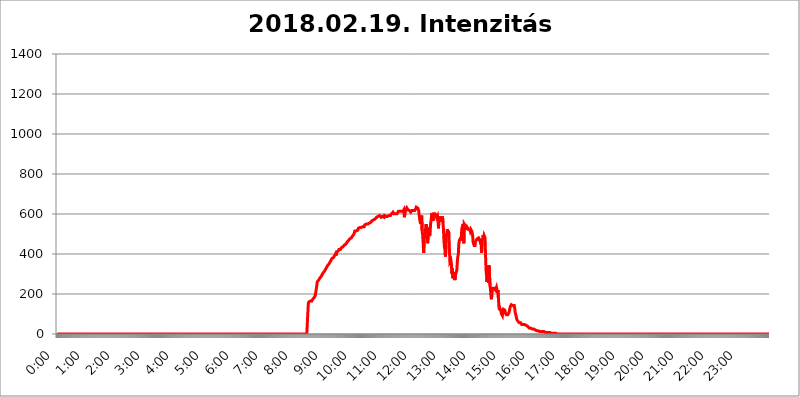
| Category | 2018.02.19. Intenzitás [W/m^2] |
|---|---|
| 0.0 | 0 |
| 0.0006944444444444445 | 0 |
| 0.001388888888888889 | 0 |
| 0.0020833333333333333 | 0 |
| 0.002777777777777778 | 0 |
| 0.003472222222222222 | 0 |
| 0.004166666666666667 | 0 |
| 0.004861111111111111 | 0 |
| 0.005555555555555556 | 0 |
| 0.0062499999999999995 | 0 |
| 0.006944444444444444 | 0 |
| 0.007638888888888889 | 0 |
| 0.008333333333333333 | 0 |
| 0.009027777777777779 | 0 |
| 0.009722222222222222 | 0 |
| 0.010416666666666666 | 0 |
| 0.011111111111111112 | 0 |
| 0.011805555555555555 | 0 |
| 0.012499999999999999 | 0 |
| 0.013194444444444444 | 0 |
| 0.013888888888888888 | 0 |
| 0.014583333333333332 | 0 |
| 0.015277777777777777 | 0 |
| 0.015972222222222224 | 0 |
| 0.016666666666666666 | 0 |
| 0.017361111111111112 | 0 |
| 0.018055555555555557 | 0 |
| 0.01875 | 0 |
| 0.019444444444444445 | 0 |
| 0.02013888888888889 | 0 |
| 0.020833333333333332 | 0 |
| 0.02152777777777778 | 0 |
| 0.022222222222222223 | 0 |
| 0.02291666666666667 | 0 |
| 0.02361111111111111 | 0 |
| 0.024305555555555556 | 0 |
| 0.024999999999999998 | 0 |
| 0.025694444444444447 | 0 |
| 0.02638888888888889 | 0 |
| 0.027083333333333334 | 0 |
| 0.027777777777777776 | 0 |
| 0.02847222222222222 | 0 |
| 0.029166666666666664 | 0 |
| 0.029861111111111113 | 0 |
| 0.030555555555555555 | 0 |
| 0.03125 | 0 |
| 0.03194444444444445 | 0 |
| 0.03263888888888889 | 0 |
| 0.03333333333333333 | 0 |
| 0.034027777777777775 | 0 |
| 0.034722222222222224 | 0 |
| 0.035416666666666666 | 0 |
| 0.036111111111111115 | 0 |
| 0.03680555555555556 | 0 |
| 0.0375 | 0 |
| 0.03819444444444444 | 0 |
| 0.03888888888888889 | 0 |
| 0.03958333333333333 | 0 |
| 0.04027777777777778 | 0 |
| 0.04097222222222222 | 0 |
| 0.041666666666666664 | 0 |
| 0.042361111111111106 | 0 |
| 0.04305555555555556 | 0 |
| 0.043750000000000004 | 0 |
| 0.044444444444444446 | 0 |
| 0.04513888888888889 | 0 |
| 0.04583333333333334 | 0 |
| 0.04652777777777778 | 0 |
| 0.04722222222222222 | 0 |
| 0.04791666666666666 | 0 |
| 0.04861111111111111 | 0 |
| 0.049305555555555554 | 0 |
| 0.049999999999999996 | 0 |
| 0.05069444444444445 | 0 |
| 0.051388888888888894 | 0 |
| 0.052083333333333336 | 0 |
| 0.05277777777777778 | 0 |
| 0.05347222222222222 | 0 |
| 0.05416666666666667 | 0 |
| 0.05486111111111111 | 0 |
| 0.05555555555555555 | 0 |
| 0.05625 | 0 |
| 0.05694444444444444 | 0 |
| 0.057638888888888885 | 0 |
| 0.05833333333333333 | 0 |
| 0.05902777777777778 | 0 |
| 0.059722222222222225 | 0 |
| 0.06041666666666667 | 0 |
| 0.061111111111111116 | 0 |
| 0.06180555555555556 | 0 |
| 0.0625 | 0 |
| 0.06319444444444444 | 0 |
| 0.06388888888888888 | 0 |
| 0.06458333333333334 | 0 |
| 0.06527777777777778 | 0 |
| 0.06597222222222222 | 0 |
| 0.06666666666666667 | 0 |
| 0.06736111111111111 | 0 |
| 0.06805555555555555 | 0 |
| 0.06874999999999999 | 0 |
| 0.06944444444444443 | 0 |
| 0.07013888888888889 | 0 |
| 0.07083333333333333 | 0 |
| 0.07152777777777779 | 0 |
| 0.07222222222222223 | 0 |
| 0.07291666666666667 | 0 |
| 0.07361111111111111 | 0 |
| 0.07430555555555556 | 0 |
| 0.075 | 0 |
| 0.07569444444444444 | 0 |
| 0.0763888888888889 | 0 |
| 0.07708333333333334 | 0 |
| 0.07777777777777778 | 0 |
| 0.07847222222222222 | 0 |
| 0.07916666666666666 | 0 |
| 0.0798611111111111 | 0 |
| 0.08055555555555556 | 0 |
| 0.08125 | 0 |
| 0.08194444444444444 | 0 |
| 0.08263888888888889 | 0 |
| 0.08333333333333333 | 0 |
| 0.08402777777777777 | 0 |
| 0.08472222222222221 | 0 |
| 0.08541666666666665 | 0 |
| 0.08611111111111112 | 0 |
| 0.08680555555555557 | 0 |
| 0.08750000000000001 | 0 |
| 0.08819444444444445 | 0 |
| 0.08888888888888889 | 0 |
| 0.08958333333333333 | 0 |
| 0.09027777777777778 | 0 |
| 0.09097222222222222 | 0 |
| 0.09166666666666667 | 0 |
| 0.09236111111111112 | 0 |
| 0.09305555555555556 | 0 |
| 0.09375 | 0 |
| 0.09444444444444444 | 0 |
| 0.09513888888888888 | 0 |
| 0.09583333333333333 | 0 |
| 0.09652777777777777 | 0 |
| 0.09722222222222222 | 0 |
| 0.09791666666666667 | 0 |
| 0.09861111111111111 | 0 |
| 0.09930555555555555 | 0 |
| 0.09999999999999999 | 0 |
| 0.10069444444444443 | 0 |
| 0.1013888888888889 | 0 |
| 0.10208333333333335 | 0 |
| 0.10277777777777779 | 0 |
| 0.10347222222222223 | 0 |
| 0.10416666666666667 | 0 |
| 0.10486111111111111 | 0 |
| 0.10555555555555556 | 0 |
| 0.10625 | 0 |
| 0.10694444444444444 | 0 |
| 0.1076388888888889 | 0 |
| 0.10833333333333334 | 0 |
| 0.10902777777777778 | 0 |
| 0.10972222222222222 | 0 |
| 0.1111111111111111 | 0 |
| 0.11180555555555556 | 0 |
| 0.11180555555555556 | 0 |
| 0.1125 | 0 |
| 0.11319444444444444 | 0 |
| 0.11388888888888889 | 0 |
| 0.11458333333333333 | 0 |
| 0.11527777777777777 | 0 |
| 0.11597222222222221 | 0 |
| 0.11666666666666665 | 0 |
| 0.1173611111111111 | 0 |
| 0.11805555555555557 | 0 |
| 0.11944444444444445 | 0 |
| 0.12013888888888889 | 0 |
| 0.12083333333333333 | 0 |
| 0.12152777777777778 | 0 |
| 0.12222222222222223 | 0 |
| 0.12291666666666667 | 0 |
| 0.12291666666666667 | 0 |
| 0.12361111111111112 | 0 |
| 0.12430555555555556 | 0 |
| 0.125 | 0 |
| 0.12569444444444444 | 0 |
| 0.12638888888888888 | 0 |
| 0.12708333333333333 | 0 |
| 0.16875 | 0 |
| 0.12847222222222224 | 0 |
| 0.12916666666666668 | 0 |
| 0.12986111111111112 | 0 |
| 0.13055555555555556 | 0 |
| 0.13125 | 0 |
| 0.13194444444444445 | 0 |
| 0.1326388888888889 | 0 |
| 0.13333333333333333 | 0 |
| 0.13402777777777777 | 0 |
| 0.13402777777777777 | 0 |
| 0.13472222222222222 | 0 |
| 0.13541666666666666 | 0 |
| 0.1361111111111111 | 0 |
| 0.13749999999999998 | 0 |
| 0.13819444444444443 | 0 |
| 0.1388888888888889 | 0 |
| 0.13958333333333334 | 0 |
| 0.14027777777777778 | 0 |
| 0.14097222222222222 | 0 |
| 0.14166666666666666 | 0 |
| 0.1423611111111111 | 0 |
| 0.14305555555555557 | 0 |
| 0.14375000000000002 | 0 |
| 0.14444444444444446 | 0 |
| 0.1451388888888889 | 0 |
| 0.1451388888888889 | 0 |
| 0.14652777777777778 | 0 |
| 0.14722222222222223 | 0 |
| 0.14791666666666667 | 0 |
| 0.1486111111111111 | 0 |
| 0.14930555555555555 | 0 |
| 0.15 | 0 |
| 0.15069444444444444 | 0 |
| 0.15138888888888888 | 0 |
| 0.15208333333333332 | 0 |
| 0.15277777777777776 | 0 |
| 0.15347222222222223 | 0 |
| 0.15416666666666667 | 0 |
| 0.15486111111111112 | 0 |
| 0.15555555555555556 | 0 |
| 0.15625 | 0 |
| 0.15694444444444444 | 0 |
| 0.15763888888888888 | 0 |
| 0.15833333333333333 | 0 |
| 0.15902777777777777 | 0 |
| 0.15972222222222224 | 0 |
| 0.16041666666666668 | 0 |
| 0.16111111111111112 | 0 |
| 0.16180555555555556 | 0 |
| 0.1625 | 0 |
| 0.16319444444444445 | 0 |
| 0.1638888888888889 | 0 |
| 0.16458333333333333 | 0 |
| 0.16527777777777777 | 0 |
| 0.16597222222222222 | 0 |
| 0.16666666666666666 | 0 |
| 0.1673611111111111 | 0 |
| 0.16805555555555554 | 0 |
| 0.16874999999999998 | 0 |
| 0.16944444444444443 | 0 |
| 0.17013888888888887 | 0 |
| 0.1708333333333333 | 0 |
| 0.17152777777777775 | 0 |
| 0.17222222222222225 | 0 |
| 0.1729166666666667 | 0 |
| 0.17361111111111113 | 0 |
| 0.17430555555555557 | 0 |
| 0.17500000000000002 | 0 |
| 0.17569444444444446 | 0 |
| 0.1763888888888889 | 0 |
| 0.17708333333333334 | 0 |
| 0.17777777777777778 | 0 |
| 0.17847222222222223 | 0 |
| 0.17916666666666667 | 0 |
| 0.1798611111111111 | 0 |
| 0.18055555555555555 | 0 |
| 0.18125 | 0 |
| 0.18194444444444444 | 0 |
| 0.1826388888888889 | 0 |
| 0.18333333333333335 | 0 |
| 0.1840277777777778 | 0 |
| 0.18472222222222223 | 0 |
| 0.18541666666666667 | 0 |
| 0.18611111111111112 | 0 |
| 0.18680555555555556 | 0 |
| 0.1875 | 0 |
| 0.18819444444444444 | 0 |
| 0.18888888888888888 | 0 |
| 0.18958333333333333 | 0 |
| 0.19027777777777777 | 0 |
| 0.1909722222222222 | 0 |
| 0.19166666666666665 | 0 |
| 0.19236111111111112 | 0 |
| 0.19305555555555554 | 0 |
| 0.19375 | 0 |
| 0.19444444444444445 | 0 |
| 0.1951388888888889 | 0 |
| 0.19583333333333333 | 0 |
| 0.19652777777777777 | 0 |
| 0.19722222222222222 | 0 |
| 0.19791666666666666 | 0 |
| 0.1986111111111111 | 0 |
| 0.19930555555555554 | 0 |
| 0.19999999999999998 | 0 |
| 0.20069444444444443 | 0 |
| 0.20138888888888887 | 0 |
| 0.2020833333333333 | 0 |
| 0.2027777777777778 | 0 |
| 0.2034722222222222 | 0 |
| 0.2041666666666667 | 0 |
| 0.20486111111111113 | 0 |
| 0.20555555555555557 | 0 |
| 0.20625000000000002 | 0 |
| 0.20694444444444446 | 0 |
| 0.2076388888888889 | 0 |
| 0.20833333333333334 | 0 |
| 0.20902777777777778 | 0 |
| 0.20972222222222223 | 0 |
| 0.21041666666666667 | 0 |
| 0.2111111111111111 | 0 |
| 0.21180555555555555 | 0 |
| 0.2125 | 0 |
| 0.21319444444444444 | 0 |
| 0.2138888888888889 | 0 |
| 0.21458333333333335 | 0 |
| 0.2152777777777778 | 0 |
| 0.21597222222222223 | 0 |
| 0.21666666666666667 | 0 |
| 0.21736111111111112 | 0 |
| 0.21805555555555556 | 0 |
| 0.21875 | 0 |
| 0.21944444444444444 | 0 |
| 0.22013888888888888 | 0 |
| 0.22083333333333333 | 0 |
| 0.22152777777777777 | 0 |
| 0.2222222222222222 | 0 |
| 0.22291666666666665 | 0 |
| 0.2236111111111111 | 0 |
| 0.22430555555555556 | 0 |
| 0.225 | 0 |
| 0.22569444444444445 | 0 |
| 0.2263888888888889 | 0 |
| 0.22708333333333333 | 0 |
| 0.22777777777777777 | 0 |
| 0.22847222222222222 | 0 |
| 0.22916666666666666 | 0 |
| 0.2298611111111111 | 0 |
| 0.23055555555555554 | 0 |
| 0.23124999999999998 | 0 |
| 0.23194444444444443 | 0 |
| 0.23263888888888887 | 0 |
| 0.2333333333333333 | 0 |
| 0.2340277777777778 | 0 |
| 0.2347222222222222 | 0 |
| 0.2354166666666667 | 0 |
| 0.23611111111111113 | 0 |
| 0.23680555555555557 | 0 |
| 0.23750000000000002 | 0 |
| 0.23819444444444446 | 0 |
| 0.2388888888888889 | 0 |
| 0.23958333333333334 | 0 |
| 0.24027777777777778 | 0 |
| 0.24097222222222223 | 0 |
| 0.24166666666666667 | 0 |
| 0.2423611111111111 | 0 |
| 0.24305555555555555 | 0 |
| 0.24375 | 0 |
| 0.24444444444444446 | 0 |
| 0.24513888888888888 | 0 |
| 0.24583333333333335 | 0 |
| 0.2465277777777778 | 0 |
| 0.24722222222222223 | 0 |
| 0.24791666666666667 | 0 |
| 0.24861111111111112 | 0 |
| 0.24930555555555556 | 0 |
| 0.25 | 0 |
| 0.25069444444444444 | 0 |
| 0.2513888888888889 | 0 |
| 0.2520833333333333 | 0 |
| 0.25277777777777777 | 0 |
| 0.2534722222222222 | 0 |
| 0.25416666666666665 | 0 |
| 0.2548611111111111 | 0 |
| 0.2555555555555556 | 0 |
| 0.25625000000000003 | 0 |
| 0.2569444444444445 | 0 |
| 0.2576388888888889 | 0 |
| 0.25833333333333336 | 0 |
| 0.2590277777777778 | 0 |
| 0.25972222222222224 | 0 |
| 0.2604166666666667 | 0 |
| 0.2611111111111111 | 0 |
| 0.26180555555555557 | 0 |
| 0.2625 | 0 |
| 0.26319444444444445 | 0 |
| 0.2638888888888889 | 0 |
| 0.26458333333333334 | 0 |
| 0.2652777777777778 | 0 |
| 0.2659722222222222 | 0 |
| 0.26666666666666666 | 0 |
| 0.2673611111111111 | 0 |
| 0.26805555555555555 | 0 |
| 0.26875 | 0 |
| 0.26944444444444443 | 0 |
| 0.2701388888888889 | 0 |
| 0.2708333333333333 | 0 |
| 0.27152777777777776 | 0 |
| 0.2722222222222222 | 0 |
| 0.27291666666666664 | 0 |
| 0.2736111111111111 | 0 |
| 0.2743055555555555 | 0 |
| 0.27499999999999997 | 0 |
| 0.27569444444444446 | 0 |
| 0.27638888888888885 | 0 |
| 0.27708333333333335 | 0 |
| 0.2777777777777778 | 0 |
| 0.27847222222222223 | 0 |
| 0.2791666666666667 | 0 |
| 0.2798611111111111 | 0 |
| 0.28055555555555556 | 0 |
| 0.28125 | 0 |
| 0.28194444444444444 | 0 |
| 0.2826388888888889 | 0 |
| 0.2833333333333333 | 0 |
| 0.28402777777777777 | 0 |
| 0.2847222222222222 | 0 |
| 0.28541666666666665 | 0 |
| 0.28611111111111115 | 0 |
| 0.28680555555555554 | 0 |
| 0.28750000000000003 | 0 |
| 0.2881944444444445 | 0 |
| 0.2888888888888889 | 0 |
| 0.28958333333333336 | 0 |
| 0.2902777777777778 | 0 |
| 0.29097222222222224 | 0 |
| 0.2916666666666667 | 0 |
| 0.2923611111111111 | 0 |
| 0.29305555555555557 | 0 |
| 0.29375 | 0 |
| 0.29444444444444445 | 0 |
| 0.2951388888888889 | 0 |
| 0.29583333333333334 | 0 |
| 0.2965277777777778 | 0 |
| 0.2972222222222222 | 0 |
| 0.29791666666666666 | 0 |
| 0.2986111111111111 | 0 |
| 0.29930555555555555 | 0 |
| 0.3 | 0 |
| 0.30069444444444443 | 0 |
| 0.3013888888888889 | 0 |
| 0.3020833333333333 | 0 |
| 0.30277777777777776 | 0 |
| 0.3034722222222222 | 0 |
| 0.30416666666666664 | 0 |
| 0.3048611111111111 | 0 |
| 0.3055555555555555 | 0 |
| 0.30624999999999997 | 0 |
| 0.3069444444444444 | 0 |
| 0.3076388888888889 | 0 |
| 0.30833333333333335 | 0 |
| 0.3090277777777778 | 0 |
| 0.30972222222222223 | 0 |
| 0.3104166666666667 | 0 |
| 0.3111111111111111 | 0 |
| 0.31180555555555556 | 0 |
| 0.3125 | 0 |
| 0.31319444444444444 | 0 |
| 0.3138888888888889 | 0 |
| 0.3145833333333333 | 0 |
| 0.31527777777777777 | 0 |
| 0.3159722222222222 | 0 |
| 0.31666666666666665 | 0 |
| 0.31736111111111115 | 0 |
| 0.31805555555555554 | 0 |
| 0.31875000000000003 | 0 |
| 0.3194444444444445 | 0 |
| 0.3201388888888889 | 0 |
| 0.32083333333333336 | 0 |
| 0.3215277777777778 | 0 |
| 0.32222222222222224 | 0 |
| 0.3229166666666667 | 0 |
| 0.3236111111111111 | 0 |
| 0.32430555555555557 | 0 |
| 0.325 | 0 |
| 0.32569444444444445 | 0 |
| 0.3263888888888889 | 0 |
| 0.32708333333333334 | 0 |
| 0.3277777777777778 | 0 |
| 0.3284722222222222 | 0 |
| 0.32916666666666666 | 0 |
| 0.3298611111111111 | 0 |
| 0.33055555555555555 | 0 |
| 0.33125 | 0 |
| 0.33194444444444443 | 0 |
| 0.3326388888888889 | 0 |
| 0.3333333333333333 | 0 |
| 0.3340277777777778 | 0 |
| 0.3347222222222222 | 0 |
| 0.3354166666666667 | 0 |
| 0.3361111111111111 | 0 |
| 0.3368055555555556 | 0 |
| 0.33749999999999997 | 0 |
| 0.33819444444444446 | 0 |
| 0.33888888888888885 | 0 |
| 0.33958333333333335 | 0 |
| 0.34027777777777773 | 0 |
| 0.34097222222222223 | 0 |
| 0.3416666666666666 | 0 |
| 0.3423611111111111 | 0 |
| 0.3430555555555555 | 0 |
| 0.34375 | 0 |
| 0.3444444444444445 | 0 |
| 0.3451388888888889 | 0 |
| 0.3458333333333334 | 0 |
| 0.34652777777777777 | 0 |
| 0.34722222222222227 | 0 |
| 0.34791666666666665 | 0 |
| 0.34861111111111115 | 0 |
| 0.34930555555555554 | 0 |
| 0.35000000000000003 | 0 |
| 0.3506944444444444 | 0 |
| 0.3513888888888889 | 0 |
| 0.3520833333333333 | 150.964 |
| 0.3527777777777778 | 160.056 |
| 0.3534722222222222 | 160.056 |
| 0.3541666666666667 | 160.056 |
| 0.3548611111111111 | 164.605 |
| 0.35555555555555557 | 164.605 |
| 0.35625 | 164.605 |
| 0.35694444444444445 | 164.605 |
| 0.3576388888888889 | 169.156 |
| 0.35833333333333334 | 173.709 |
| 0.3590277777777778 | 173.709 |
| 0.3597222222222222 | 178.264 |
| 0.36041666666666666 | 182.82 |
| 0.3611111111111111 | 187.378 |
| 0.36180555555555555 | 191.937 |
| 0.3625 | 191.937 |
| 0.36319444444444443 | 196.497 |
| 0.3638888888888889 | 237.564 |
| 0.3645833333333333 | 260.373 |
| 0.3652777777777778 | 260.373 |
| 0.3659722222222222 | 264.932 |
| 0.3666666666666667 | 269.49 |
| 0.3673611111111111 | 274.047 |
| 0.3680555555555556 | 278.603 |
| 0.36874999999999997 | 278.603 |
| 0.36944444444444446 | 283.156 |
| 0.37013888888888885 | 287.709 |
| 0.37083333333333335 | 292.259 |
| 0.37152777777777773 | 296.808 |
| 0.37222222222222223 | 296.808 |
| 0.3729166666666666 | 305.898 |
| 0.3736111111111111 | 305.898 |
| 0.3743055555555555 | 310.44 |
| 0.375 | 314.98 |
| 0.3756944444444445 | 319.517 |
| 0.3763888888888889 | 324.052 |
| 0.3770833333333334 | 328.584 |
| 0.37777777777777777 | 333.113 |
| 0.37847222222222227 | 333.113 |
| 0.37916666666666665 | 342.162 |
| 0.37986111111111115 | 346.682 |
| 0.38055555555555554 | 346.682 |
| 0.38125000000000003 | 351.198 |
| 0.3819444444444444 | 355.712 |
| 0.3826388888888889 | 360.221 |
| 0.3833333333333333 | 364.728 |
| 0.3840277777777778 | 369.23 |
| 0.3847222222222222 | 369.23 |
| 0.3854166666666667 | 378.224 |
| 0.3861111111111111 | 378.224 |
| 0.38680555555555557 | 378.224 |
| 0.3875 | 382.715 |
| 0.38819444444444445 | 387.202 |
| 0.3888888888888889 | 391.685 |
| 0.38958333333333334 | 396.164 |
| 0.3902777777777778 | 400.638 |
| 0.3909722222222222 | 391.685 |
| 0.39166666666666666 | 409.574 |
| 0.3923611111111111 | 414.035 |
| 0.39305555555555555 | 414.035 |
| 0.39375 | 414.035 |
| 0.39444444444444443 | 418.492 |
| 0.3951388888888889 | 422.943 |
| 0.3958333333333333 | 422.943 |
| 0.3965277777777778 | 427.39 |
| 0.3972222222222222 | 422.943 |
| 0.3979166666666667 | 427.39 |
| 0.3986111111111111 | 431.833 |
| 0.3993055555555556 | 436.27 |
| 0.39999999999999997 | 431.833 |
| 0.40069444444444446 | 436.27 |
| 0.40138888888888885 | 440.702 |
| 0.40208333333333335 | 440.702 |
| 0.40277777777777773 | 445.129 |
| 0.40347222222222223 | 445.129 |
| 0.4041666666666666 | 445.129 |
| 0.4048611111111111 | 449.551 |
| 0.4055555555555555 | 453.968 |
| 0.40625 | 458.38 |
| 0.4069444444444445 | 458.38 |
| 0.4076388888888889 | 462.786 |
| 0.4083333333333334 | 467.187 |
| 0.40902777777777777 | 471.582 |
| 0.40972222222222227 | 471.582 |
| 0.41041666666666665 | 475.972 |
| 0.41111111111111115 | 475.972 |
| 0.41180555555555554 | 480.356 |
| 0.41250000000000003 | 480.356 |
| 0.4131944444444444 | 484.735 |
| 0.4138888888888889 | 489.108 |
| 0.4145833333333333 | 489.108 |
| 0.4152777777777778 | 489.108 |
| 0.4159722222222222 | 497.836 |
| 0.4166666666666667 | 506.542 |
| 0.4173611111111111 | 515.223 |
| 0.41805555555555557 | 515.223 |
| 0.41875 | 510.885 |
| 0.41944444444444445 | 515.223 |
| 0.4201388888888889 | 519.555 |
| 0.42083333333333334 | 519.555 |
| 0.4215277777777778 | 519.555 |
| 0.4222222222222222 | 528.2 |
| 0.42291666666666666 | 528.2 |
| 0.4236111111111111 | 532.513 |
| 0.42430555555555555 | 532.513 |
| 0.425 | 532.513 |
| 0.42569444444444443 | 532.513 |
| 0.4263888888888889 | 532.513 |
| 0.4270833333333333 | 532.513 |
| 0.4277777777777778 | 532.513 |
| 0.4284722222222222 | 536.82 |
| 0.4291666666666667 | 541.121 |
| 0.4298611111111111 | 536.82 |
| 0.4305555555555556 | 536.82 |
| 0.43124999999999997 | 545.416 |
| 0.43194444444444446 | 549.704 |
| 0.43263888888888885 | 549.704 |
| 0.43333333333333335 | 549.704 |
| 0.43402777777777773 | 549.704 |
| 0.43472222222222223 | 549.704 |
| 0.4354166666666666 | 549.704 |
| 0.4361111111111111 | 549.704 |
| 0.4368055555555555 | 553.986 |
| 0.4375 | 553.986 |
| 0.4381944444444445 | 558.261 |
| 0.4388888888888889 | 558.261 |
| 0.4395833333333334 | 558.261 |
| 0.44027777777777777 | 558.261 |
| 0.44097222222222227 | 558.261 |
| 0.44166666666666665 | 566.793 |
| 0.44236111111111115 | 571.049 |
| 0.44305555555555554 | 571.049 |
| 0.44375000000000003 | 571.049 |
| 0.4444444444444444 | 575.299 |
| 0.4451388888888889 | 575.299 |
| 0.4458333333333333 | 575.299 |
| 0.4465277777777778 | 575.299 |
| 0.4472222222222222 | 579.542 |
| 0.4479166666666667 | 583.779 |
| 0.4486111111111111 | 579.542 |
| 0.44930555555555557 | 583.779 |
| 0.45 | 588.009 |
| 0.45069444444444445 | 588.009 |
| 0.4513888888888889 | 592.233 |
| 0.45208333333333334 | 592.233 |
| 0.4527777777777778 | 592.233 |
| 0.4534722222222222 | 588.009 |
| 0.45416666666666666 | 583.779 |
| 0.4548611111111111 | 583.779 |
| 0.45555555555555555 | 588.009 |
| 0.45625 | 588.009 |
| 0.45694444444444443 | 588.009 |
| 0.4576388888888889 | 588.009 |
| 0.4583333333333333 | 583.779 |
| 0.4590277777777778 | 592.233 |
| 0.4597222222222222 | 592.233 |
| 0.4604166666666667 | 588.009 |
| 0.4611111111111111 | 588.009 |
| 0.4618055555555556 | 588.009 |
| 0.46249999999999997 | 588.009 |
| 0.46319444444444446 | 588.009 |
| 0.46388888888888885 | 583.779 |
| 0.46458333333333335 | 588.009 |
| 0.46527777777777773 | 592.233 |
| 0.46597222222222223 | 592.233 |
| 0.4666666666666666 | 592.233 |
| 0.4673611111111111 | 592.233 |
| 0.4680555555555555 | 592.233 |
| 0.46875 | 600.661 |
| 0.4694444444444445 | 604.864 |
| 0.4701388888888889 | 604.864 |
| 0.4708333333333334 | 609.062 |
| 0.47152777777777777 | 604.864 |
| 0.47222222222222227 | 600.661 |
| 0.47291666666666665 | 600.661 |
| 0.47361111111111115 | 600.661 |
| 0.47430555555555554 | 600.661 |
| 0.47500000000000003 | 600.661 |
| 0.4756944444444444 | 600.661 |
| 0.4763888888888889 | 600.661 |
| 0.4770833333333333 | 604.864 |
| 0.4777777777777778 | 604.864 |
| 0.4784722222222222 | 613.252 |
| 0.4791666666666667 | 613.252 |
| 0.4798611111111111 | 613.252 |
| 0.48055555555555557 | 613.252 |
| 0.48125 | 613.252 |
| 0.48194444444444445 | 613.252 |
| 0.4826388888888889 | 613.252 |
| 0.48333333333333334 | 613.252 |
| 0.4840277777777778 | 617.436 |
| 0.4847222222222222 | 613.252 |
| 0.48541666666666666 | 617.436 |
| 0.4861111111111111 | 621.613 |
| 0.48680555555555555 | 583.779 |
| 0.4875 | 600.661 |
| 0.48819444444444443 | 625.784 |
| 0.4888888888888889 | 617.436 |
| 0.4895833333333333 | 621.613 |
| 0.4902777777777778 | 629.948 |
| 0.4909722222222222 | 625.784 |
| 0.4916666666666667 | 621.613 |
| 0.4923611111111111 | 621.613 |
| 0.4930555555555556 | 621.613 |
| 0.49374999999999997 | 617.436 |
| 0.49444444444444446 | 617.436 |
| 0.49513888888888885 | 613.252 |
| 0.49583333333333335 | 609.062 |
| 0.49652777777777773 | 613.252 |
| 0.49722222222222223 | 617.436 |
| 0.4979166666666666 | 617.436 |
| 0.4986111111111111 | 617.436 |
| 0.4993055555555555 | 617.436 |
| 0.5 | 617.436 |
| 0.5006944444444444 | 617.436 |
| 0.5013888888888889 | 617.436 |
| 0.5020833333333333 | 621.613 |
| 0.5027777777777778 | 625.784 |
| 0.5034722222222222 | 634.105 |
| 0.5041666666666667 | 634.105 |
| 0.5048611111111111 | 634.105 |
| 0.5055555555555555 | 629.948 |
| 0.50625 | 634.105 |
| 0.5069444444444444 | 617.436 |
| 0.5076388888888889 | 592.233 |
| 0.5083333333333333 | 575.299 |
| 0.5090277777777777 | 558.261 |
| 0.5097222222222222 | 549.704 |
| 0.5104166666666666 | 583.779 |
| 0.5111111111111112 | 592.233 |
| 0.5118055555555555 | 515.223 |
| 0.5125000000000001 | 493.475 |
| 0.5131944444444444 | 453.968 |
| 0.513888888888889 | 405.108 |
| 0.5145833333333333 | 462.786 |
| 0.5152777777777778 | 493.475 |
| 0.5159722222222222 | 506.542 |
| 0.5166666666666667 | 510.885 |
| 0.517361111111111 | 549.704 |
| 0.5180555555555556 | 523.88 |
| 0.5187499999999999 | 506.542 |
| 0.5194444444444445 | 453.968 |
| 0.5201388888888888 | 489.108 |
| 0.5208333333333334 | 532.513 |
| 0.5215277777777778 | 506.542 |
| 0.5222222222222223 | 489.108 |
| 0.5229166666666667 | 506.542 |
| 0.5236111111111111 | 549.704 |
| 0.5243055555555556 | 566.793 |
| 0.525 | 592.233 |
| 0.5256944444444445 | 604.864 |
| 0.5263888888888889 | 609.062 |
| 0.5270833333333333 | 566.793 |
| 0.5277777777777778 | 600.661 |
| 0.5284722222222222 | 600.661 |
| 0.5291666666666667 | 600.661 |
| 0.5298611111111111 | 600.661 |
| 0.5305555555555556 | 600.661 |
| 0.53125 | 592.233 |
| 0.5319444444444444 | 583.779 |
| 0.5326388888888889 | 588.009 |
| 0.5333333333333333 | 592.233 |
| 0.5340277777777778 | 566.793 |
| 0.5347222222222222 | 528.2 |
| 0.5354166666666667 | 588.009 |
| 0.5361111111111111 | 575.299 |
| 0.5368055555555555 | 588.009 |
| 0.5375 | 592.233 |
| 0.5381944444444444 | 571.049 |
| 0.5388888888888889 | 562.53 |
| 0.5395833333333333 | 579.542 |
| 0.5402777777777777 | 588.009 |
| 0.5409722222222222 | 558.261 |
| 0.5416666666666666 | 523.88 |
| 0.5423611111111112 | 467.187 |
| 0.5430555555555555 | 431.833 |
| 0.5437500000000001 | 440.702 |
| 0.5444444444444444 | 387.202 |
| 0.545138888888889 | 431.833 |
| 0.5458333333333333 | 493.475 |
| 0.5465277777777778 | 506.542 |
| 0.5472222222222222 | 523.88 |
| 0.5479166666666667 | 506.542 |
| 0.548611111111111 | 515.223 |
| 0.5493055555555556 | 502.192 |
| 0.5499999999999999 | 422.943 |
| 0.5506944444444445 | 360.221 |
| 0.5513888888888888 | 355.712 |
| 0.5520833333333334 | 369.23 |
| 0.5527777777777778 | 351.198 |
| 0.5534722222222223 | 301.354 |
| 0.5541666666666667 | 328.584 |
| 0.5548611111111111 | 278.603 |
| 0.5555555555555556 | 278.603 |
| 0.55625 | 301.354 |
| 0.5569444444444445 | 310.44 |
| 0.5576388888888889 | 269.49 |
| 0.5583333333333333 | 287.709 |
| 0.5590277777777778 | 301.354 |
| 0.5597222222222222 | 305.898 |
| 0.5604166666666667 | 319.517 |
| 0.5611111111111111 | 360.221 |
| 0.5618055555555556 | 387.202 |
| 0.5625 | 396.164 |
| 0.5631944444444444 | 449.551 |
| 0.5638888888888889 | 467.187 |
| 0.5645833333333333 | 467.187 |
| 0.5652777777777778 | 475.972 |
| 0.5659722222222222 | 467.187 |
| 0.5666666666666667 | 480.356 |
| 0.5673611111111111 | 523.88 |
| 0.5680555555555555 | 536.82 |
| 0.56875 | 541.121 |
| 0.5694444444444444 | 549.704 |
| 0.5701388888888889 | 453.968 |
| 0.5708333333333333 | 549.704 |
| 0.5715277777777777 | 549.704 |
| 0.5722222222222222 | 541.121 |
| 0.5729166666666666 | 536.82 |
| 0.5736111111111112 | 536.82 |
| 0.5743055555555555 | 519.555 |
| 0.5750000000000001 | 532.513 |
| 0.5756944444444444 | 532.513 |
| 0.576388888888889 | 523.88 |
| 0.5770833333333333 | 523.88 |
| 0.5777777777777778 | 523.88 |
| 0.5784722222222222 | 523.88 |
| 0.5791666666666667 | 515.223 |
| 0.579861111111111 | 523.88 |
| 0.5805555555555556 | 519.555 |
| 0.5812499999999999 | 515.223 |
| 0.5819444444444445 | 506.542 |
| 0.5826388888888888 | 493.475 |
| 0.5833333333333334 | 458.38 |
| 0.5840277777777778 | 449.551 |
| 0.5847222222222223 | 453.968 |
| 0.5854166666666667 | 436.27 |
| 0.5861111111111111 | 458.38 |
| 0.5868055555555556 | 462.786 |
| 0.5875 | 467.187 |
| 0.5881944444444445 | 467.187 |
| 0.5888888888888889 | 475.972 |
| 0.5895833333333333 | 480.356 |
| 0.5902777777777778 | 480.356 |
| 0.5909722222222222 | 480.356 |
| 0.5916666666666667 | 480.356 |
| 0.5923611111111111 | 480.356 |
| 0.5930555555555556 | 462.786 |
| 0.59375 | 475.972 |
| 0.5944444444444444 | 449.551 |
| 0.5951388888888889 | 405.108 |
| 0.5958333333333333 | 462.786 |
| 0.5965277777777778 | 471.582 |
| 0.5972222222222222 | 493.475 |
| 0.5979166666666667 | 480.356 |
| 0.5986111111111111 | 493.475 |
| 0.5993055555555555 | 489.108 |
| 0.6 | 480.356 |
| 0.6006944444444444 | 396.164 |
| 0.6013888888888889 | 319.517 |
| 0.6020833333333333 | 292.259 |
| 0.6027777777777777 | 260.373 |
| 0.6034722222222222 | 342.162 |
| 0.6041666666666666 | 292.259 |
| 0.6048611111111112 | 255.813 |
| 0.6055555555555555 | 342.162 |
| 0.6062500000000001 | 346.682 |
| 0.6069444444444444 | 242.127 |
| 0.607638888888889 | 223.873 |
| 0.6083333333333333 | 187.378 |
| 0.6090277777777778 | 173.709 |
| 0.6097222222222222 | 214.746 |
| 0.6104166666666667 | 228.436 |
| 0.611111111111111 | 233 |
| 0.6118055555555556 | 223.873 |
| 0.6124999999999999 | 228.436 |
| 0.6131944444444445 | 228.436 |
| 0.6138888888888888 | 228.436 |
| 0.6145833333333334 | 219.309 |
| 0.6152777777777778 | 223.873 |
| 0.6159722222222223 | 233 |
| 0.6166666666666667 | 219.309 |
| 0.6173611111111111 | 205.62 |
| 0.6180555555555556 | 219.309 |
| 0.61875 | 178.264 |
| 0.6194444444444445 | 137.347 |
| 0.6201388888888889 | 119.235 |
| 0.6208333333333333 | 128.284 |
| 0.6215277777777778 | 123.758 |
| 0.6222222222222222 | 114.716 |
| 0.6229166666666667 | 101.184 |
| 0.6236111111111111 | 96.682 |
| 0.6243055555555556 | 92.184 |
| 0.625 | 114.716 |
| 0.6256944444444444 | 123.758 |
| 0.6263888888888889 | 128.284 |
| 0.6270833333333333 | 119.235 |
| 0.6277777777777778 | 119.235 |
| 0.6284722222222222 | 105.69 |
| 0.6291666666666667 | 101.184 |
| 0.6298611111111111 | 96.682 |
| 0.6305555555555555 | 101.184 |
| 0.63125 | 96.682 |
| 0.6319444444444444 | 96.682 |
| 0.6326388888888889 | 101.184 |
| 0.6333333333333333 | 105.69 |
| 0.6340277777777777 | 114.716 |
| 0.6347222222222222 | 119.235 |
| 0.6354166666666666 | 137.347 |
| 0.6361111111111112 | 137.347 |
| 0.6368055555555555 | 146.423 |
| 0.6375000000000001 | 146.423 |
| 0.6381944444444444 | 146.423 |
| 0.638888888888889 | 141.884 |
| 0.6395833333333333 | 141.884 |
| 0.6402777777777778 | 137.347 |
| 0.6409722222222222 | 141.884 |
| 0.6416666666666667 | 128.284 |
| 0.642361111111111 | 105.69 |
| 0.6430555555555556 | 96.682 |
| 0.6437499999999999 | 87.692 |
| 0.6444444444444445 | 74.246 |
| 0.6451388888888888 | 74.246 |
| 0.6458333333333334 | 65.31 |
| 0.6465277777777778 | 65.31 |
| 0.6472222222222223 | 60.85 |
| 0.6479166666666667 | 56.398 |
| 0.6486111111111111 | 60.85 |
| 0.6493055555555556 | 56.398 |
| 0.65 | 56.398 |
| 0.6506944444444445 | 51.951 |
| 0.6513888888888889 | 47.511 |
| 0.6520833333333333 | 43.079 |
| 0.6527777777777778 | 47.511 |
| 0.6534722222222222 | 47.511 |
| 0.6541666666666667 | 43.079 |
| 0.6548611111111111 | 43.079 |
| 0.6555555555555556 | 47.511 |
| 0.65625 | 47.511 |
| 0.6569444444444444 | 43.079 |
| 0.6576388888888889 | 43.079 |
| 0.6583333333333333 | 43.079 |
| 0.6590277777777778 | 38.653 |
| 0.6597222222222222 | 38.653 |
| 0.6604166666666667 | 38.653 |
| 0.6611111111111111 | 34.234 |
| 0.6618055555555555 | 29.823 |
| 0.6625 | 29.823 |
| 0.6631944444444444 | 29.823 |
| 0.6638888888888889 | 29.823 |
| 0.6645833333333333 | 29.823 |
| 0.6652777777777777 | 25.419 |
| 0.6659722222222222 | 25.419 |
| 0.6666666666666666 | 25.419 |
| 0.6673611111111111 | 25.419 |
| 0.6680555555555556 | 25.419 |
| 0.6687500000000001 | 21.024 |
| 0.6694444444444444 | 21.024 |
| 0.6701388888888888 | 21.024 |
| 0.6708333333333334 | 21.024 |
| 0.6715277777777778 | 21.024 |
| 0.6722222222222222 | 16.636 |
| 0.6729166666666666 | 16.636 |
| 0.6736111111111112 | 16.636 |
| 0.6743055555555556 | 16.636 |
| 0.6749999999999999 | 16.636 |
| 0.6756944444444444 | 12.257 |
| 0.6763888888888889 | 12.257 |
| 0.6770833333333334 | 12.257 |
| 0.6777777777777777 | 12.257 |
| 0.6784722222222223 | 12.257 |
| 0.6791666666666667 | 12.257 |
| 0.6798611111111111 | 12.257 |
| 0.6805555555555555 | 12.257 |
| 0.68125 | 12.257 |
| 0.6819444444444445 | 7.887 |
| 0.6826388888888889 | 12.257 |
| 0.6833333333333332 | 12.257 |
| 0.6840277777777778 | 7.887 |
| 0.6847222222222222 | 7.887 |
| 0.6854166666666667 | 7.887 |
| 0.686111111111111 | 7.887 |
| 0.6868055555555556 | 7.887 |
| 0.6875 | 7.887 |
| 0.6881944444444444 | 7.887 |
| 0.688888888888889 | 7.887 |
| 0.6895833333333333 | 7.887 |
| 0.6902777777777778 | 7.887 |
| 0.6909722222222222 | 7.887 |
| 0.6916666666666668 | 7.887 |
| 0.6923611111111111 | 3.525 |
| 0.6930555555555555 | 3.525 |
| 0.69375 | 3.525 |
| 0.6944444444444445 | 3.525 |
| 0.6951388888888889 | 3.525 |
| 0.6958333333333333 | 3.525 |
| 0.6965277777777777 | 3.525 |
| 0.6972222222222223 | 3.525 |
| 0.6979166666666666 | 3.525 |
| 0.6986111111111111 | 3.525 |
| 0.6993055555555556 | 3.525 |
| 0.7000000000000001 | 0 |
| 0.7006944444444444 | 0 |
| 0.7013888888888888 | 0 |
| 0.7020833333333334 | 0 |
| 0.7027777777777778 | 0 |
| 0.7034722222222222 | 0 |
| 0.7041666666666666 | 0 |
| 0.7048611111111112 | 0 |
| 0.7055555555555556 | 0 |
| 0.7062499999999999 | 0 |
| 0.7069444444444444 | 0 |
| 0.7076388888888889 | 0 |
| 0.7083333333333334 | 0 |
| 0.7090277777777777 | 0 |
| 0.7097222222222223 | 0 |
| 0.7104166666666667 | 0 |
| 0.7111111111111111 | 0 |
| 0.7118055555555555 | 0 |
| 0.7125 | 0 |
| 0.7131944444444445 | 0 |
| 0.7138888888888889 | 0 |
| 0.7145833333333332 | 0 |
| 0.7152777777777778 | 0 |
| 0.7159722222222222 | 0 |
| 0.7166666666666667 | 0 |
| 0.717361111111111 | 0 |
| 0.7180555555555556 | 0 |
| 0.71875 | 0 |
| 0.7194444444444444 | 0 |
| 0.720138888888889 | 0 |
| 0.7208333333333333 | 0 |
| 0.7215277777777778 | 0 |
| 0.7222222222222222 | 0 |
| 0.7229166666666668 | 0 |
| 0.7236111111111111 | 0 |
| 0.7243055555555555 | 0 |
| 0.725 | 0 |
| 0.7256944444444445 | 0 |
| 0.7263888888888889 | 0 |
| 0.7270833333333333 | 0 |
| 0.7277777777777777 | 0 |
| 0.7284722222222223 | 0 |
| 0.7291666666666666 | 0 |
| 0.7298611111111111 | 0 |
| 0.7305555555555556 | 0 |
| 0.7312500000000001 | 0 |
| 0.7319444444444444 | 0 |
| 0.7326388888888888 | 0 |
| 0.7333333333333334 | 0 |
| 0.7340277777777778 | 0 |
| 0.7347222222222222 | 0 |
| 0.7354166666666666 | 0 |
| 0.7361111111111112 | 0 |
| 0.7368055555555556 | 0 |
| 0.7374999999999999 | 0 |
| 0.7381944444444444 | 0 |
| 0.7388888888888889 | 0 |
| 0.7395833333333334 | 0 |
| 0.7402777777777777 | 0 |
| 0.7409722222222223 | 0 |
| 0.7416666666666667 | 0 |
| 0.7423611111111111 | 0 |
| 0.7430555555555555 | 0 |
| 0.74375 | 0 |
| 0.7444444444444445 | 0 |
| 0.7451388888888889 | 0 |
| 0.7458333333333332 | 0 |
| 0.7465277777777778 | 0 |
| 0.7472222222222222 | 0 |
| 0.7479166666666667 | 0 |
| 0.748611111111111 | 0 |
| 0.7493055555555556 | 0 |
| 0.75 | 0 |
| 0.7506944444444444 | 0 |
| 0.751388888888889 | 0 |
| 0.7520833333333333 | 0 |
| 0.7527777777777778 | 0 |
| 0.7534722222222222 | 0 |
| 0.7541666666666668 | 0 |
| 0.7548611111111111 | 0 |
| 0.7555555555555555 | 0 |
| 0.75625 | 0 |
| 0.7569444444444445 | 0 |
| 0.7576388888888889 | 0 |
| 0.7583333333333333 | 0 |
| 0.7590277777777777 | 0 |
| 0.7597222222222223 | 0 |
| 0.7604166666666666 | 0 |
| 0.7611111111111111 | 0 |
| 0.7618055555555556 | 0 |
| 0.7625000000000001 | 0 |
| 0.7631944444444444 | 0 |
| 0.7638888888888888 | 0 |
| 0.7645833333333334 | 0 |
| 0.7652777777777778 | 0 |
| 0.7659722222222222 | 0 |
| 0.7666666666666666 | 0 |
| 0.7673611111111112 | 0 |
| 0.7680555555555556 | 0 |
| 0.7687499999999999 | 0 |
| 0.7694444444444444 | 0 |
| 0.7701388888888889 | 0 |
| 0.7708333333333334 | 0 |
| 0.7715277777777777 | 0 |
| 0.7722222222222223 | 0 |
| 0.7729166666666667 | 0 |
| 0.7736111111111111 | 0 |
| 0.7743055555555555 | 0 |
| 0.775 | 0 |
| 0.7756944444444445 | 0 |
| 0.7763888888888889 | 0 |
| 0.7770833333333332 | 0 |
| 0.7777777777777778 | 0 |
| 0.7784722222222222 | 0 |
| 0.7791666666666667 | 0 |
| 0.779861111111111 | 0 |
| 0.7805555555555556 | 0 |
| 0.78125 | 0 |
| 0.7819444444444444 | 0 |
| 0.782638888888889 | 0 |
| 0.7833333333333333 | 0 |
| 0.7840277777777778 | 0 |
| 0.7847222222222222 | 0 |
| 0.7854166666666668 | 0 |
| 0.7861111111111111 | 0 |
| 0.7868055555555555 | 0 |
| 0.7875 | 0 |
| 0.7881944444444445 | 0 |
| 0.7888888888888889 | 0 |
| 0.7895833333333333 | 0 |
| 0.7902777777777777 | 0 |
| 0.7909722222222223 | 0 |
| 0.7916666666666666 | 0 |
| 0.7923611111111111 | 0 |
| 0.7930555555555556 | 0 |
| 0.7937500000000001 | 0 |
| 0.7944444444444444 | 0 |
| 0.7951388888888888 | 0 |
| 0.7958333333333334 | 0 |
| 0.7965277777777778 | 0 |
| 0.7972222222222222 | 0 |
| 0.7979166666666666 | 0 |
| 0.7986111111111112 | 0 |
| 0.7993055555555556 | 0 |
| 0.7999999999999999 | 0 |
| 0.8006944444444444 | 0 |
| 0.8013888888888889 | 0 |
| 0.8020833333333334 | 0 |
| 0.8027777777777777 | 0 |
| 0.8034722222222223 | 0 |
| 0.8041666666666667 | 0 |
| 0.8048611111111111 | 0 |
| 0.8055555555555555 | 0 |
| 0.80625 | 0 |
| 0.8069444444444445 | 0 |
| 0.8076388888888889 | 0 |
| 0.8083333333333332 | 0 |
| 0.8090277777777778 | 0 |
| 0.8097222222222222 | 0 |
| 0.8104166666666667 | 0 |
| 0.811111111111111 | 0 |
| 0.8118055555555556 | 0 |
| 0.8125 | 0 |
| 0.8131944444444444 | 0 |
| 0.813888888888889 | 0 |
| 0.8145833333333333 | 0 |
| 0.8152777777777778 | 0 |
| 0.8159722222222222 | 0 |
| 0.8166666666666668 | 0 |
| 0.8173611111111111 | 0 |
| 0.8180555555555555 | 0 |
| 0.81875 | 0 |
| 0.8194444444444445 | 0 |
| 0.8201388888888889 | 0 |
| 0.8208333333333333 | 0 |
| 0.8215277777777777 | 0 |
| 0.8222222222222223 | 0 |
| 0.8229166666666666 | 0 |
| 0.8236111111111111 | 0 |
| 0.8243055555555556 | 0 |
| 0.8250000000000001 | 0 |
| 0.8256944444444444 | 0 |
| 0.8263888888888888 | 0 |
| 0.8270833333333334 | 0 |
| 0.8277777777777778 | 0 |
| 0.8284722222222222 | 0 |
| 0.8291666666666666 | 0 |
| 0.8298611111111112 | 0 |
| 0.8305555555555556 | 0 |
| 0.8312499999999999 | 0 |
| 0.8319444444444444 | 0 |
| 0.8326388888888889 | 0 |
| 0.8333333333333334 | 0 |
| 0.8340277777777777 | 0 |
| 0.8347222222222223 | 0 |
| 0.8354166666666667 | 0 |
| 0.8361111111111111 | 0 |
| 0.8368055555555555 | 0 |
| 0.8375 | 0 |
| 0.8381944444444445 | 0 |
| 0.8388888888888889 | 0 |
| 0.8395833333333332 | 0 |
| 0.8402777777777778 | 0 |
| 0.8409722222222222 | 0 |
| 0.8416666666666667 | 0 |
| 0.842361111111111 | 0 |
| 0.8430555555555556 | 0 |
| 0.84375 | 0 |
| 0.8444444444444444 | 0 |
| 0.845138888888889 | 0 |
| 0.8458333333333333 | 0 |
| 0.8465277777777778 | 0 |
| 0.8472222222222222 | 0 |
| 0.8479166666666668 | 0 |
| 0.8486111111111111 | 0 |
| 0.8493055555555555 | 0 |
| 0.85 | 0 |
| 0.8506944444444445 | 0 |
| 0.8513888888888889 | 0 |
| 0.8520833333333333 | 0 |
| 0.8527777777777777 | 0 |
| 0.8534722222222223 | 0 |
| 0.8541666666666666 | 0 |
| 0.8548611111111111 | 0 |
| 0.8555555555555556 | 0 |
| 0.8562500000000001 | 0 |
| 0.8569444444444444 | 0 |
| 0.8576388888888888 | 0 |
| 0.8583333333333334 | 0 |
| 0.8590277777777778 | 0 |
| 0.8597222222222222 | 0 |
| 0.8604166666666666 | 0 |
| 0.8611111111111112 | 0 |
| 0.8618055555555556 | 0 |
| 0.8624999999999999 | 0 |
| 0.8631944444444444 | 0 |
| 0.8638888888888889 | 0 |
| 0.8645833333333334 | 0 |
| 0.8652777777777777 | 0 |
| 0.8659722222222223 | 0 |
| 0.8666666666666667 | 0 |
| 0.8673611111111111 | 0 |
| 0.8680555555555555 | 0 |
| 0.86875 | 0 |
| 0.8694444444444445 | 0 |
| 0.8701388888888889 | 0 |
| 0.8708333333333332 | 0 |
| 0.8715277777777778 | 0 |
| 0.8722222222222222 | 0 |
| 0.8729166666666667 | 0 |
| 0.873611111111111 | 0 |
| 0.8743055555555556 | 0 |
| 0.875 | 0 |
| 0.8756944444444444 | 0 |
| 0.876388888888889 | 0 |
| 0.8770833333333333 | 0 |
| 0.8777777777777778 | 0 |
| 0.8784722222222222 | 0 |
| 0.8791666666666668 | 0 |
| 0.8798611111111111 | 0 |
| 0.8805555555555555 | 0 |
| 0.88125 | 0 |
| 0.8819444444444445 | 0 |
| 0.8826388888888889 | 0 |
| 0.8833333333333333 | 0 |
| 0.8840277777777777 | 0 |
| 0.8847222222222223 | 0 |
| 0.8854166666666666 | 0 |
| 0.8861111111111111 | 0 |
| 0.8868055555555556 | 0 |
| 0.8875000000000001 | 0 |
| 0.8881944444444444 | 0 |
| 0.8888888888888888 | 0 |
| 0.8895833333333334 | 0 |
| 0.8902777777777778 | 0 |
| 0.8909722222222222 | 0 |
| 0.8916666666666666 | 0 |
| 0.8923611111111112 | 0 |
| 0.8930555555555556 | 0 |
| 0.8937499999999999 | 0 |
| 0.8944444444444444 | 0 |
| 0.8951388888888889 | 0 |
| 0.8958333333333334 | 0 |
| 0.8965277777777777 | 0 |
| 0.8972222222222223 | 0 |
| 0.8979166666666667 | 0 |
| 0.8986111111111111 | 0 |
| 0.8993055555555555 | 0 |
| 0.9 | 0 |
| 0.9006944444444445 | 0 |
| 0.9013888888888889 | 0 |
| 0.9020833333333332 | 0 |
| 0.9027777777777778 | 0 |
| 0.9034722222222222 | 0 |
| 0.9041666666666667 | 0 |
| 0.904861111111111 | 0 |
| 0.9055555555555556 | 0 |
| 0.90625 | 0 |
| 0.9069444444444444 | 0 |
| 0.907638888888889 | 0 |
| 0.9083333333333333 | 0 |
| 0.9090277777777778 | 0 |
| 0.9097222222222222 | 0 |
| 0.9104166666666668 | 0 |
| 0.9111111111111111 | 0 |
| 0.9118055555555555 | 0 |
| 0.9125 | 0 |
| 0.9131944444444445 | 0 |
| 0.9138888888888889 | 0 |
| 0.9145833333333333 | 0 |
| 0.9152777777777777 | 0 |
| 0.9159722222222223 | 0 |
| 0.9166666666666666 | 0 |
| 0.9173611111111111 | 0 |
| 0.9180555555555556 | 0 |
| 0.9187500000000001 | 0 |
| 0.9194444444444444 | 0 |
| 0.9201388888888888 | 0 |
| 0.9208333333333334 | 0 |
| 0.9215277777777778 | 0 |
| 0.9222222222222222 | 0 |
| 0.9229166666666666 | 0 |
| 0.9236111111111112 | 0 |
| 0.9243055555555556 | 0 |
| 0.9249999999999999 | 0 |
| 0.9256944444444444 | 0 |
| 0.9263888888888889 | 0 |
| 0.9270833333333334 | 0 |
| 0.9277777777777777 | 0 |
| 0.9284722222222223 | 0 |
| 0.9291666666666667 | 0 |
| 0.9298611111111111 | 0 |
| 0.9305555555555555 | 0 |
| 0.93125 | 0 |
| 0.9319444444444445 | 0 |
| 0.9326388888888889 | 0 |
| 0.9333333333333332 | 0 |
| 0.9340277777777778 | 0 |
| 0.9347222222222222 | 0 |
| 0.9354166666666667 | 0 |
| 0.936111111111111 | 0 |
| 0.9368055555555556 | 0 |
| 0.9375 | 0 |
| 0.9381944444444444 | 0 |
| 0.938888888888889 | 0 |
| 0.9395833333333333 | 0 |
| 0.9402777777777778 | 0 |
| 0.9409722222222222 | 0 |
| 0.9416666666666668 | 0 |
| 0.9423611111111111 | 0 |
| 0.9430555555555555 | 0 |
| 0.94375 | 0 |
| 0.9444444444444445 | 0 |
| 0.9451388888888889 | 0 |
| 0.9458333333333333 | 0 |
| 0.9465277777777777 | 0 |
| 0.9472222222222223 | 0 |
| 0.9479166666666666 | 0 |
| 0.9486111111111111 | 0 |
| 0.9493055555555556 | 0 |
| 0.9500000000000001 | 0 |
| 0.9506944444444444 | 0 |
| 0.9513888888888888 | 0 |
| 0.9520833333333334 | 0 |
| 0.9527777777777778 | 0 |
| 0.9534722222222222 | 0 |
| 0.9541666666666666 | 0 |
| 0.9548611111111112 | 0 |
| 0.9555555555555556 | 0 |
| 0.9562499999999999 | 0 |
| 0.9569444444444444 | 0 |
| 0.9576388888888889 | 0 |
| 0.9583333333333334 | 0 |
| 0.9590277777777777 | 0 |
| 0.9597222222222223 | 0 |
| 0.9604166666666667 | 0 |
| 0.9611111111111111 | 0 |
| 0.9618055555555555 | 0 |
| 0.9625 | 0 |
| 0.9631944444444445 | 0 |
| 0.9638888888888889 | 0 |
| 0.9645833333333332 | 0 |
| 0.9652777777777778 | 0 |
| 0.9659722222222222 | 0 |
| 0.9666666666666667 | 0 |
| 0.967361111111111 | 0 |
| 0.9680555555555556 | 0 |
| 0.96875 | 0 |
| 0.9694444444444444 | 0 |
| 0.970138888888889 | 0 |
| 0.9708333333333333 | 0 |
| 0.9715277777777778 | 0 |
| 0.9722222222222222 | 0 |
| 0.9729166666666668 | 0 |
| 0.9736111111111111 | 0 |
| 0.9743055555555555 | 0 |
| 0.975 | 0 |
| 0.9756944444444445 | 0 |
| 0.9763888888888889 | 0 |
| 0.9770833333333333 | 0 |
| 0.9777777777777777 | 0 |
| 0.9784722222222223 | 0 |
| 0.9791666666666666 | 0 |
| 0.9798611111111111 | 0 |
| 0.9805555555555556 | 0 |
| 0.9812500000000001 | 0 |
| 0.9819444444444444 | 0 |
| 0.9826388888888888 | 0 |
| 0.9833333333333334 | 0 |
| 0.9840277777777778 | 0 |
| 0.9847222222222222 | 0 |
| 0.9854166666666666 | 0 |
| 0.9861111111111112 | 0 |
| 0.9868055555555556 | 0 |
| 0.9874999999999999 | 0 |
| 0.9881944444444444 | 0 |
| 0.9888888888888889 | 0 |
| 0.9895833333333334 | 0 |
| 0.9902777777777777 | 0 |
| 0.9909722222222223 | 0 |
| 0.9916666666666667 | 0 |
| 0.9923611111111111 | 0 |
| 0.9930555555555555 | 0 |
| 0.99375 | 0 |
| 0.9944444444444445 | 0 |
| 0.9951388888888889 | 0 |
| 0.9958333333333332 | 0 |
| 0.9965277777777778 | 0 |
| 0.9972222222222222 | 0 |
| 0.9979166666666667 | 0 |
| 0.998611111111111 | 0 |
| 0.9993055555555556 | 0 |